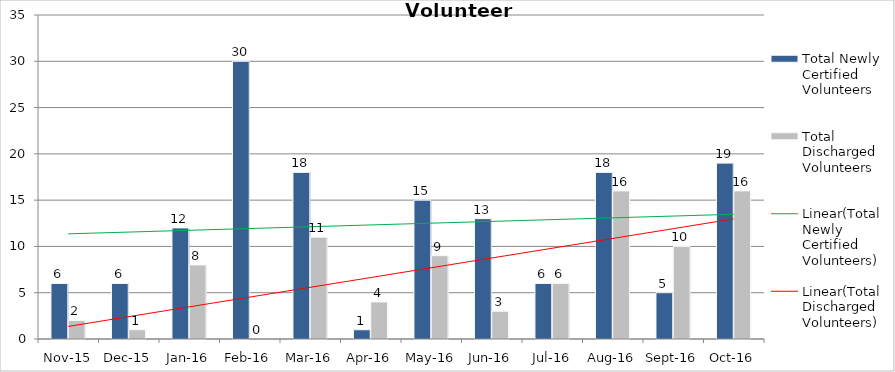
| Category | Total Newly Certified Volunteers | Total Discharged Volunteers |
|---|---|---|
| Nov-15 | 6 | 2 |
| Dec-15 | 6 | 1 |
| Jan-16 | 12 | 8 |
| Feb-16 | 30 | 0 |
| Mar-16 | 18 | 11 |
| Apr-16 | 1 | 4 |
| May-16 | 15 | 9 |
| Jun-16 | 13 | 3 |
| Jul-16 | 6 | 6 |
| Aug-16 | 18 | 16 |
| Sep-16 | 5 | 10 |
| Oct-16 | 19 | 16 |